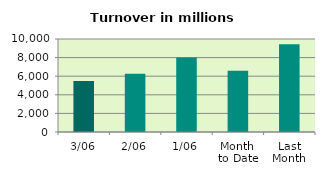
| Category | Series 0 |
|---|---|
| 3/06 | 5496.621 |
| 2/06 | 6270.236 |
| 1/06 | 8003.474 |
| Month 
to Date | 6590.11 |
| Last
Month | 9444.716 |